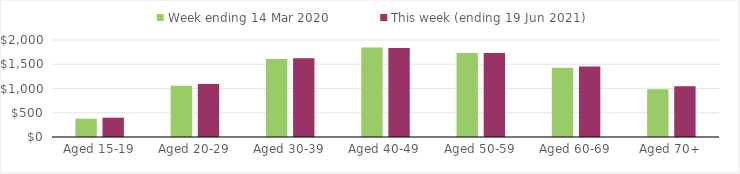
| Category | Week ending 14 Mar 2020 | This week (ending 19 Jun 2021) |
|---|---|---|
| Aged 15-19 | 377.49 | 397.76 |
| Aged 20-29 | 1055.49 | 1091.18 |
| Aged 30-39 | 1610.23 | 1621.36 |
| Aged 40-49 | 1846.62 | 1832.7 |
| Aged 50-59 | 1732.26 | 1732.9 |
| Aged 60-69 | 1428.77 | 1454.66 |
| Aged 70+ | 982.81 | 1048.45 |